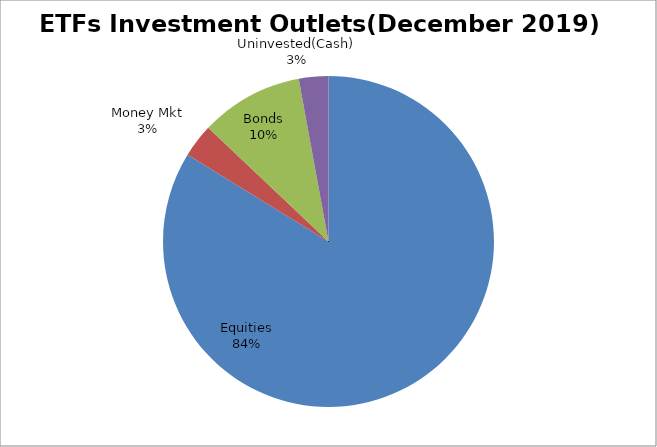
| Category | Series 0 |
|---|---|
| Equities | 4408225444.33 |
| Money Mkt | 171857896.38 |
| Bonds | 529473292.36 |
| Uninvested(Cash) | 151803547.97 |